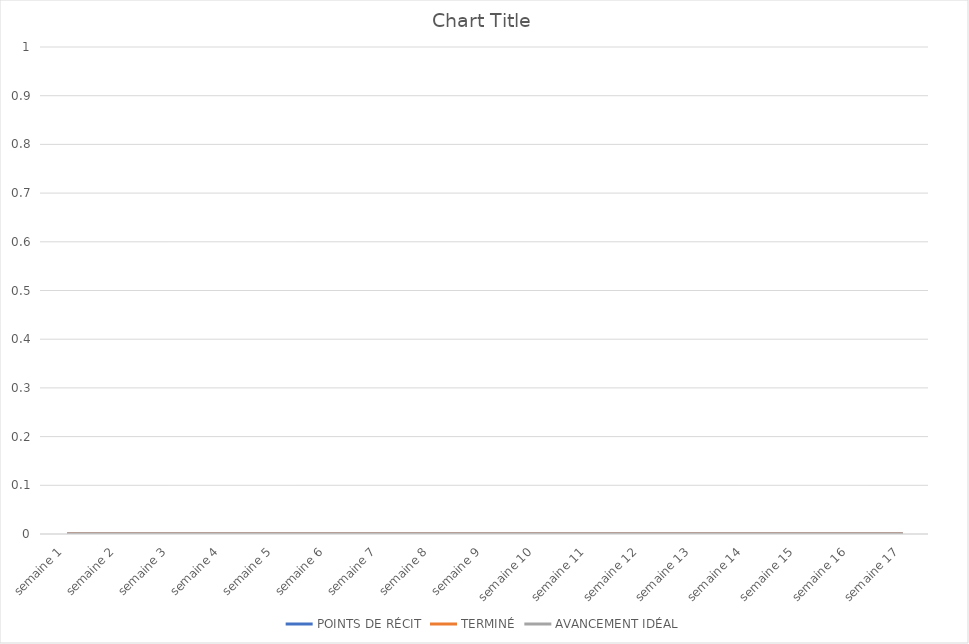
| Category | POINTS DE RÉCIT | TERMINÉ | AVANCEMENT IDÉAL |
|---|---|---|---|
| semaine 1 | 0 | 0 | 0 |
| semaine 2 | 0 | 0 | 0 |
| semaine 3 | 0 | 0 | 0 |
| semaine 4 | 0 | 0 | 0 |
| semaine 5 | 0 | 0 | 0 |
| semaine 6 | 0 | 0 | 0 |
| semaine 7 | 0 | 0 | 0 |
| semaine 8 | 0 | 0 | 0 |
| semaine 9 | 0 | 0 | 0 |
| semaine 10 | 0 | 0 | 0 |
| semaine 11 | 0 | 0 | 0 |
| semaine 12 | 0 | 0 | 0 |
| semaine 13 | 0 | 0 | 0 |
| semaine 14 | 0 | 0 | 0 |
| semaine 15 | 0 | 0 | 0 |
| semaine 16 | 0 | 0 | 0 |
| semaine 17 | 0 | 0 | 0 |